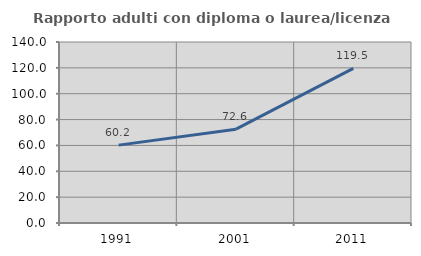
| Category | Rapporto adulti con diploma o laurea/licenza media  |
|---|---|
| 1991.0 | 60.241 |
| 2001.0 | 72.558 |
| 2011.0 | 119.538 |